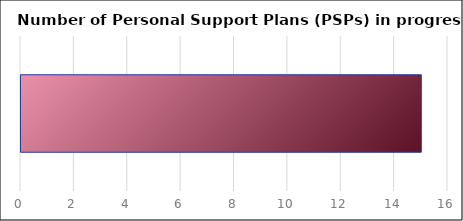
| Category | Series 1 |
|---|---|
| Number of PSP's in progress | 15 |